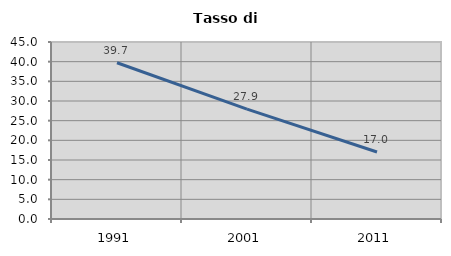
| Category | Tasso di disoccupazione   |
|---|---|
| 1991.0 | 39.724 |
| 2001.0 | 27.937 |
| 2011.0 | 17.036 |